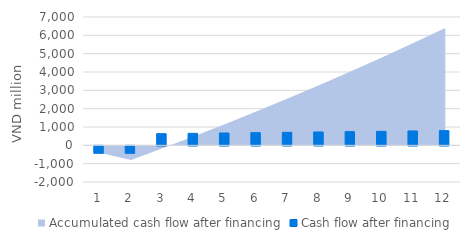
| Category | Cash flow after financing |
|---|---|
| 1.0 | -400 |
| 2.0 | -400 |
| 3.0 | 635.428 |
| 4.0 | 654.111 |
| 5.0 | 672.795 |
| 6.0 | 691.479 |
| 7.0 | 710.163 |
| 8.0 | 728.846 |
| 9.0 | 747.53 |
| 10.0 | 766.214 |
| 11.0 | 784.898 |
| 12.0 | 803.582 |